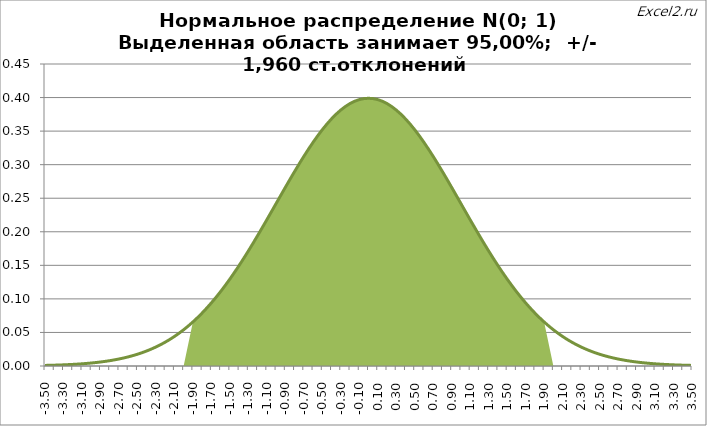
| Category | Линия |
|---|---|
| 0 | 0.001 |
| 1 | 0.001 |
| 2 | 0.002 |
| 3 | 0.002 |
| 4 | 0.003 |
| 5 | 0.004 |
| 6 | 0.006 |
| 7 | 0.008 |
| 8 | 0.01 |
| 9 | 0.014 |
| 10 | 0.018 |
| 11 | 0.022 |
| 12 | 0.028 |
| 13 | 0.035 |
| 14 | 0.044 |
| 15 | 0.054 |
| 16 | 0.066 |
| 17 | 0.079 |
| 18 | 0.094 |
| 19 | 0.111 |
| 20 | 0.13 |
| 21 | 0.15 |
| 22 | 0.171 |
| 23 | 0.194 |
| 24 | 0.218 |
| 25 | 0.242 |
| 26 | 0.266 |
| 27 | 0.29 |
| 28 | 0.312 |
| 29 | 0.333 |
| 30 | 0.352 |
| 31 | 0.368 |
| 32 | 0.381 |
| 33 | 0.391 |
| 34 | 0.397 |
| 35 | 0.399 |
| 36 | 0.397 |
| 37 | 0.391 |
| 38 | 0.381 |
| 39 | 0.368 |
| 40 | 0.352 |
| 41 | 0.333 |
| 42 | 0.312 |
| 43 | 0.29 |
| 44 | 0.266 |
| 45 | 0.242 |
| 46 | 0.218 |
| 47 | 0.194 |
| 48 | 0.171 |
| 49 | 0.15 |
| 50 | 0.13 |
| 51 | 0.111 |
| 52 | 0.094 |
| 53 | 0.079 |
| 54 | 0.066 |
| 55 | 0.054 |
| 56 | 0.044 |
| 57 | 0.035 |
| 58 | 0.028 |
| 59 | 0.022 |
| 60 | 0.018 |
| 61 | 0.014 |
| 62 | 0.01 |
| 63 | 0.008 |
| 64 | 0.006 |
| 65 | 0.004 |
| 66 | 0.003 |
| 67 | 0.002 |
| 68 | 0.002 |
| 69 | 0.001 |
| 70 | 0.001 |